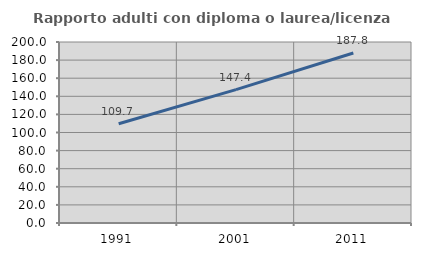
| Category | Rapporto adulti con diploma o laurea/licenza media  |
|---|---|
| 1991.0 | 109.735 |
| 2001.0 | 147.357 |
| 2011.0 | 187.794 |